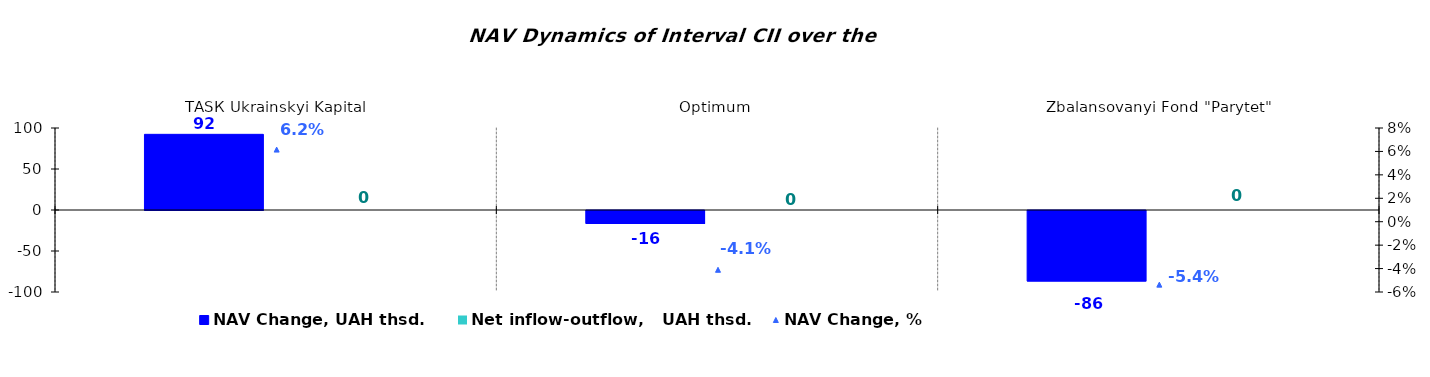
| Category | NAV Change, UAH thsd. | Net inflow-outflow,   UAH thsd. |
|---|---|---|
| ТАSК Ukrainskyi Kapital | 92.276 | 0 |
| Оptimum | -15.727 | 0 |
| Zbalansovanyi Fond "Parytet" | -86.078 | 0 |